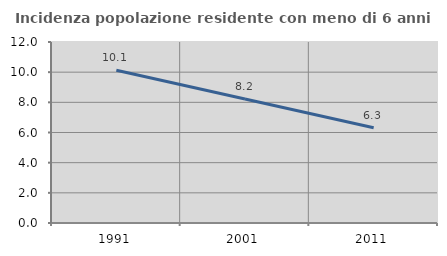
| Category | Incidenza popolazione residente con meno di 6 anni |
|---|---|
| 1991.0 | 10.122 |
| 2001.0 | 8.223 |
| 2011.0 | 6.32 |